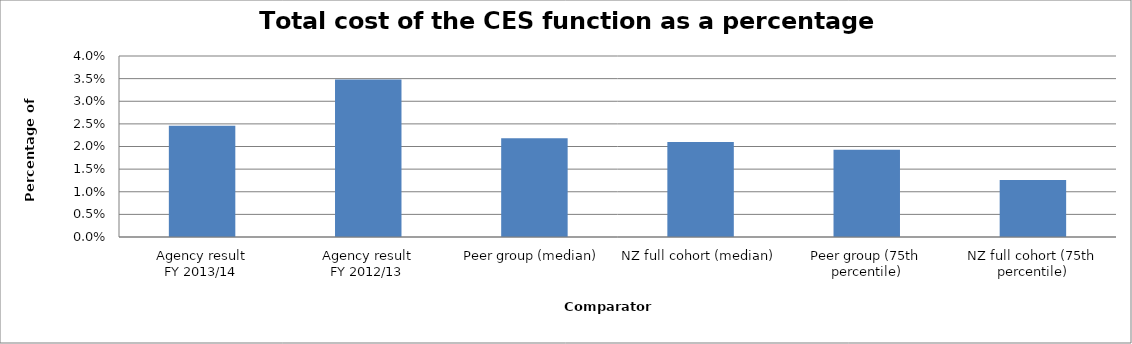
| Category | Result |
|---|---|
| Agency result
FY 2013/14 | 0.025 |
| Agency result
FY 2012/13 | 0.035 |
| Peer group (median) | 0.022 |
| NZ full cohort (median) | 0.021 |
| Peer group (75th percentile) | 0.019 |
| NZ full cohort (75th percentile) | 0.013 |